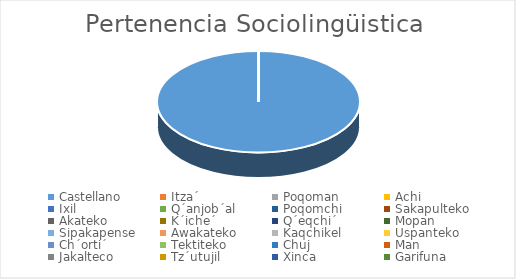
| Category | Series 0 |
|---|---|
| Castellano | 71 |
| Itza´ | 0 |
| Poqoman | 0 |
| Achi | 0 |
| Ixil | 0 |
| Q´anjob´al | 0 |
| Poqomchi | 0 |
| Sakapulteko | 0 |
| Akateko | 0 |
| K´iche´ | 0 |
| Q´eqchi´ | 0 |
| Mopan | 0 |
| Sipakapense | 0 |
| Awakateko | 0 |
| Kaqchikel | 0 |
| Uspanteko | 0 |
| Ch´orti´ | 0 |
| Tektiteko | 0 |
| Chuj | 0 |
| Man | 0 |
| Jakalteco | 0 |
| Tz´utujil | 0 |
| Xinca | 0 |
| Garifuna | 0 |